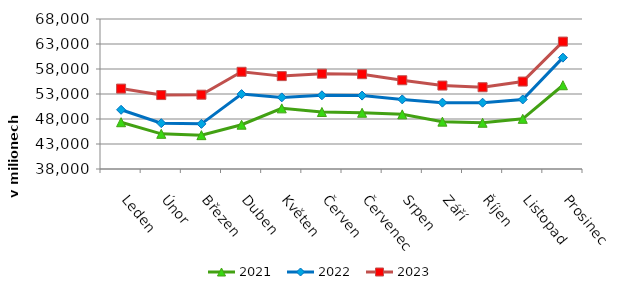
| Category | 2021 | 2022 | 2023 |
|---|---|---|---|
| Leden | 47356.114 | 49842.271 | 54079.175 |
| Únor | 45036.142 | 47163.482 | 52785.289 |
| Březen | 44769.404 | 47027.101 | 52858.235 |
| Duben  | 46859.485 | 52977.569 | 57441.457 |
| Květen | 50125.315 | 52323.978 | 56576.039 |
| Červen | 49404.932 | 52744.155 | 57061.431 |
| Červenec | 49248.499 | 52682.845 | 56962.258 |
| Srpen | 48927.934 | 51920.038 | 55752.514 |
| Září | 47470.49 | 51271.531 | 54690.341 |
| Říjen | 47249.297 | 51263.747 | 54352.293 |
| Listopad | 48034.567 | 51904.924 | 55484.516 |
| Prosinec | 54750.412 | 60271.74 | 63482.365 |